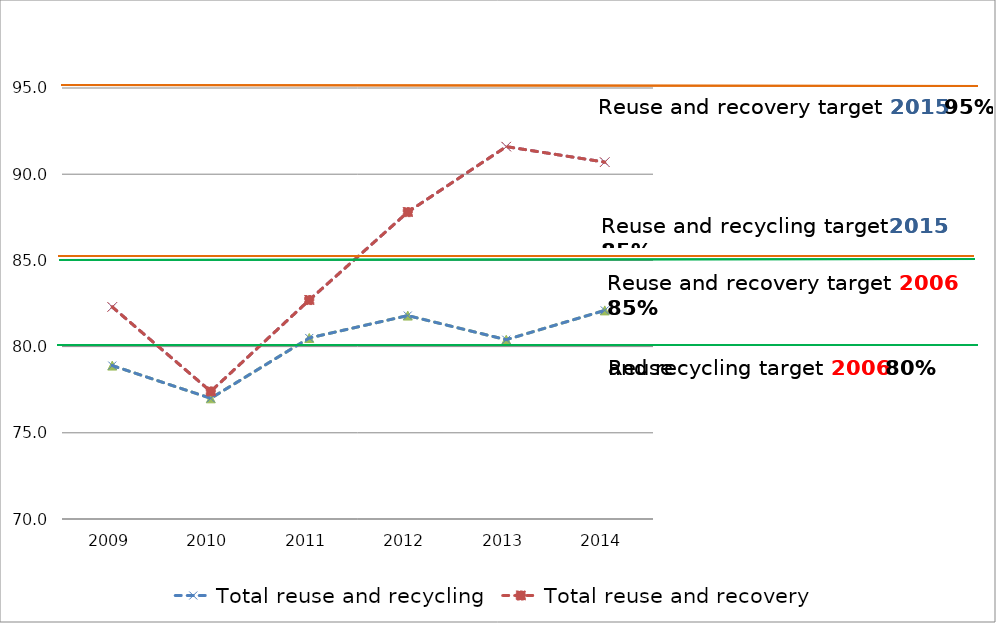
| Category | Total reuse and recycling | Total reuse and recovery |
|---|---|---|
| 2009.0 | 78.9 | 82.3 |
| 2010.0 | 77 | 77.4 |
| 2011.0 | 80.5 | 82.7 |
| 2012.0 | 81.8 | 87.8 |
| 2013.0 | 80.4 | 91.6 |
| 2014.0 | 82.1 | 90.7 |